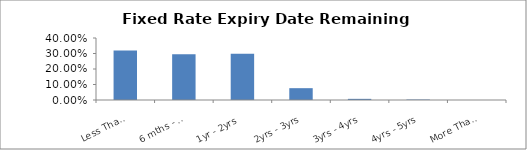
| Category | Series 0 |
|---|---|
| Less Than 6 mths | 0.32 |
| 6 mths - 1yr | 0.295 |
| 1yr - 2yrs | 0.298 |
| 2yrs - 3yrs | 0.076 |
| 3yrs - 4yrs | 0.007 |
| 4yrs - 5yrs | 0.003 |
| More Than 5 yrs | 0 |